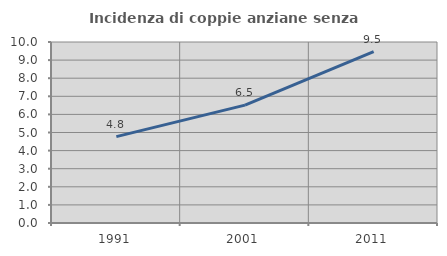
| Category | Incidenza di coppie anziane senza figli  |
|---|---|
| 1991.0 | 4.773 |
| 2001.0 | 6.514 |
| 2011.0 | 9.469 |